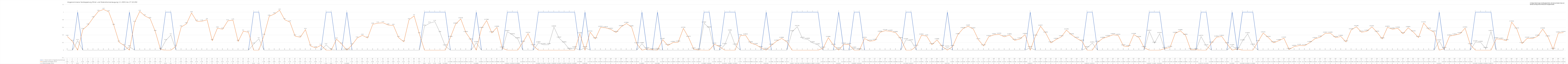
| Category | 1 = Strom reicht im Tagesdurchschnitt aus | Zusätzlich benötigter Strom | Überschüssiger Strom |
|---|---|---|---|
| 0 | 0 | 0.36 | 0 |
| 1 | 0 | 0.23 | 0 |
| 2 | 1 | 0 | 0.25 |
| 3 | 0 | 0.54 | 0 |
| 4 | 0 | 0.66 | 0 |
| 5 | 0 | 0.85 | 0 |
| 6 | 0 | 1.02 | 0 |
| 7 | 0 | 1.07 | 0 |
| 8 | 0 | 1.01 | 0 |
| 9 | 0 | 0.65 | 0 |
| 10 | 0 | 0.21 | 0 |
| 11 | 0 | 0.12 | 0 |
| 12 | 1 | 0 | 0.09 |
| 13 | 0 | 0.73 | 0 |
| 14 | 0 | 1.02 | 0 |
| 15 | 0 | 0.9 | 0 |
| 16 | 0 | 0.83 | 0 |
| 17 | 0 | 0.49 | 0 |
| 18 | 0 | 0.02 | 0 |
| 19 | 1 | 0 | 0.25 |
| 20 | 1 | 0 | 0.4 |
| 21 | 0 | 0.1 | 0 |
| 22 | 0 | 0.61 | 0 |
| 23 | 0 | 0.69 | 0 |
| 24 | 0 | 0.98 | 0 |
| 25 | 0 | 0.76 | 0 |
| 26 | 0 | 0.76 | 0 |
| 27 | 0 | 0.8 | 0 |
| 28 | 0 | 0.25 | 0 |
| 29 | 0 | 0.58 | 0 |
| 30 | 0 | 0.55 | 0 |
| 31 | 0 | 0.77 | 0 |
| 32 | 0 | 0.79 | 0 |
| 33 | 0 | 0.23 | 0 |
| 34 | 0 | 0.5 | 0 |
| 35 | 0 | 0.47 | 0 |
| 36 | 1 | 0 | 0.16 |
| 37 | 1 | 0 | 0.3 |
| 38 | 0 | 0.39 | 0 |
| 39 | 0 | 0.89 | 0 |
| 40 | 0 | 0.95 | 0 |
| 41 | 0 | 1.05 | 0 |
| 42 | 0 | 0.8 | 0 |
| 43 | 0 | 0.74 | 0 |
| 44 | 0 | 0.37 | 0 |
| 45 | 0 | 0.34 | 0 |
| 46 | 0 | 0.54 | 0 |
| 47 | 0 | 0.11 | 0 |
| 48 | 0 | 0.06 | 0 |
| 49 | 0 | 0.13 | 0 |
| 50 | 1 | 0 | 0.14 |
| 51 | 1 | 0 | 0.01 |
| 52 | 0 | 0.29 | 0 |
| 53 | 0 | 0.16 | 0 |
| 54 | 1 | 0 | 0 |
| 55 | 0 | 0.14 | 0 |
| 56 | 0 | 0.32 | 0 |
| 57 | 0 | 0.39 | 0 |
| 58 | 0 | 0.32 | 0 |
| 59 | 0 | 0.68 | 0 |
| 60 | 0 | 0.71 | 0 |
| 61 | 0 | 0.72 | 0 |
| 62 | 0 | 0.66 | 0 |
| 63 | 0 | 0.65 | 0 |
| 64 | 0 | 0.33 | 0 |
| 65 | 0 | 0.22 | 0 |
| 66 | 0 | 0.8 | 0 |
| 67 | 0 | 0.9 | 0 |
| 68 | 0 | 0.43 | 0 |
| 69 | 1 | 0 | 0.63 |
| 70 | 1 | 0 | 0.71 |
| 71 | 1 | 0 | 0.75 |
| 72 | 1 | 0 | 0.46 |
| 73 | 1 | 0 | 0.11 |
| 74 | 0 | 0.335 | 0 |
| 75 | 0 | 0.683 | 0 |
| 76 | 0 | 0.822 | 0 |
| 77 | 0 | 0.459 | 0 |
| 78 | 0 | 0.265 | 0 |
| 79 | 1 | 0 | 0.195 |
| 80 | 0 | 0.568 | 0 |
| 81 | 0 | 0.78 | 0 |
| 82 | 0 | 0.454 | 0 |
| 83 | 0 | 0.6 | 0 |
| 84 | 0 | 0.055 | 0 |
| 85 | 1 | 0 | 0.484 |
| 86 | 1 | 0 | 0.402 |
| 87 | 1 | 0 | 0.297 |
| 88 | 0 | 0.206 | 0 |
| 89 | 0 | 0.437 | 0 |
| 90 | 0 | 0.115 | 0 |
| 91 | 1 | 0 | 0.189 |
| 92 | 1 | 0 | 0.142 |
| 93 | 1 | 0 | 0.144 |
| 94 | 1 | 0 | 0.606 |
| 95 | 1 | 0 | 0.315 |
| 96 | 1 | 0 | 0.189 |
| 97 | 1 | 0 | 0.021 |
| 98 | 1 | 0 | 0.059 |
| 99 | 0 | 0.428 | 0 |
| 100 | 1 | 0 | 0.063 |
| 101 | 0 | 0.473 | 0 |
| 102 | 0 | 0.298 | 0 |
| 103 | 0 | 0.597 | 0 |
| 104 | 0 | 0.587 | 0 |
| 105 | 0 | 0.546 | 0 |
| 106 | 0 | 0.465 | 0 |
| 107 | 0 | 0.616 | 0 |
| 108 | 0 | 0.701 | 0 |
| 109 | 0 | 0.61 | 0 |
| 110 | 0 | 0.166 | 0 |
| 111 | 1 | 0 | 0.17 |
| 112 | 0 | 0.034 | 0 |
| 113 | 0 | 0.014 | 0 |
| 114 | 1 | 0 | 0.016 |
| 115 | 0 | 0.277 | 0 |
| 116 | 0 | 0.123 | 0 |
| 117 | 0 | 0.2 | 0 |
| 118 | 0 | 0.21 | 0 |
| 119 | 0 | 0.573 | 0 |
| 120 | 0 | 0.335 | 0 |
| 121 | 0 | 0.028 | 0 |
| 122 | 0 | 0.003 | 0 |
| 123 | 1 | 0 | 0.71 |
| 124 | 1 | 0 | 0.582 |
| 125 | 0 | 0.155 | 0 |
| 126 | 0 | 0.092 | 0 |
| 127 | 1 | 0 | 0.142 |
| 128 | 1 | 0 | 0.5 |
| 129 | 1 | 0 | 0.131 |
| 130 | 0 | 0.379 | 0 |
| 131 | 0 | 0.395 | 0 |
| 132 | 0 | 0.188 | 0 |
| 133 | 0 | 0.143 | 0 |
| 134 | 0 | 0.064 | 0 |
| 135 | 1 | 0 | 0.021 |
| 136 | 0 | 0.129 | 0 |
| 137 | 0 | 0.236 | 0 |
| 138 | 0 | 0.309 | 0 |
| 139 | 0 | 0.217 | 0 |
| 140 | 1 | 0 | 0.482 |
| 141 | 1 | 0 | 0.617 |
| 142 | 1 | 0 | 0.307 |
| 143 | 1 | 0 | 0.283 |
| 144 | 1 | 0 | 0.189 |
| 145 | 1 | 0 | 0.138 |
| 146 | 0 | 0.052 | 0 |
| 147 | 0 | 0.329 | 0 |
| 148 | 0 | 0.128 | 0 |
| 149 | 1 | 0 | 0.035 |
| 150 | 0 | 0.156 | 0 |
| 151 | 0 | 0.146 | 0 |
| 152 | 1 | 0 | 0.05 |
| 153 | 1 | 0 | 0.014 |
| 154 | 0 | 0.307 | 0 |
| 155 | 0 | 0.234 | 0 |
| 156 | 0 | 0.255 | 0 |
| 157 | 0 | 0.469 | 0 |
| 158 | 0 | 0.512 | 0 |
| 159 | 0 | 0.495 | 0 |
| 160 | 0 | 0.461 | 0 |
| 161 | 0 | 0.3 | 0 |
| 162 | 1 | 0 | 0.274 |
| 163 | 1 | 0 | 0.243 |
| 164 | 0 | 0.101 | 0 |
| 165 | 0 | 0.393 | 0 |
| 166 | 0 | 0.369 | 0 |
| 167 | 0 | 0.144 | 0 |
| 168 | 0 | 0.27 | 0 |
| 169 | 0 | 0.095 | 0 |
| 170 | 1 | 0 | 0.077 |
| 171 | 0 | 0.095 | 0 |
| 172 | 0 | 0.406 | 0 |
| 173 | 0 | 0.563 | 0 |
| 174 | 0 | 0.63 | 0 |
| 175 | 0 | 0.556 | 0 |
| 176 | 0 | 0.273 | 0 |
| 177 | 0 | 0.11 | 0 |
| 178 | 0 | 0.355 | 0 |
| 179 | 0 | 0.403 | 0 |
| 180 | 0 | 0.415 | 0 |
| 181 | 0 | 0.351 | 0 |
| 182 | 0 | 0.399 | 0 |
| 183 | 0 | 0.258 | 0 |
| 184 | 0 | 0.293 | 0 |
| 185 | 0 | 0.408 | 0 |
| 186 | 1 | 0 | 0.065 |
| 187 | 0 | 0.367 | 0 |
| 188 | 0 | 0.629 | 0 |
| 189 | 0 | 0.448 | 0 |
| 190 | 0 | 0.191 | 0 |
| 191 | 0 | 0.281 | 0 |
| 192 | 0 | 0.35 | 0 |
| 193 | 0 | 0.528 | 0 |
| 194 | 0 | 0.402 | 0 |
| 195 | 0 | 0.31 | 0 |
| 196 | 0 | 0.235 | 0 |
| 197 | 1 | 0 | 0.063 |
| 198 | 1 | 0 | 0.187 |
| 199 | 0 | 0.206 | 0 |
| 200 | 0 | 0.309 | 0 |
| 201 | 0 | 0.354 | 0 |
| 202 | 0 | 0.404 | 0 |
| 203 | 0 | 0.388 | 0 |
| 204 | 0 | 0.11 | 0 |
| 205 | 0 | 0.093 | 0 |
| 206 | 0 | 0.41 | 0 |
| 207 | 0 | 0.329 | 0 |
| 208 | 0 | 0.066 | 0 |
| 209 | 1 | 0 | 0.493 |
| 210 | 1 | 0 | 0.182 |
| 211 | 1 | 0 | 0.433 |
| 212 | 0 | 0.042 | 0 |
| 213 | 0 | 0.071 | 0 |
| 214 | 0 | 0.441 | 0 |
| 215 | 0 | 0.51 | 0 |
| 216 | 0 | 0.389 | 0 |
| 217 | 0 | 0.012 | 0 |
| 218 | 0 | 0.011 | 0 |
| 219 | 1 | 0 | 0.358 |
| 220 | 1 | 0 | 0.112 |
| 221 | 0 | 0.184 | 0 |
| 222 | 0 | 0.34 | 0 |
| 223 | 0 | 0.36 | 0 |
| 224 | 0 | 0.168 | 0 |
| 225 | 1 | 0 | 0.116 |
| 226 | 0 | 0.036 | 0 |
| 227 | 1 | 0 | 0.242 |
| 228 | 1 | 0 | 0.43 |
| 229 | 1 | 0 | 0.129 |
| 230 | 0 | 0.223 | 0 |
| 231 | 0 | 0.451 | 0 |
| 232 | 0 | 0.331 | 0 |
| 233 | 0 | 0.194 | 0 |
| 234 | 0 | 0.249 | 0 |
| 235 | 0 | 0.314 | 0 |
| 236 | 0 | 0.019 | 0 |
| 237 | 0 | 0.095 | 0 |
| 238 | 0 | 0.122 | 0 |
| 239 | 0 | 0.118 | 0 |
| 240 | 0 | 0.198 | 0 |
| 241 | 0 | 0.302 | 0 |
| 242 | 0 | 0.341 | 0 |
| 243 | 0 | 0.444 | 0 |
| 244 | 0 | 0.445 | 0 |
| 245 | 0 | 0.329 | 0 |
| 246 | 0 | 0.361 | 0 |
| 247 | 0 | 0.216 | 0 |
| 248 | 0 | 0.534 | 0 |
| 249 | 0 | 0.615 | 0 |
| 250 | 0 | 0.472 | 0 |
| 251 | 0 | 0.495 | 0 |
| 252 | 0 | 0.613 | 0 |
| 253 | 0 | 0.47 | 0 |
| 254 | 0 | 0.296 | 0 |
| 255 | 0 | 0.6 | 0 |
| 256 | 0 | 0.55 | 0 |
| 257 | 0 | 0.576 | 0 |
| 258 | 0 | 0.432 | 0 |
| 259 | 0 | 0.59 | 0 |
| 260 | 0 | 0.477 | 0 |
| 261 | 0 | 0.331 | 0 |
| 262 | 0 | 0.714 | 0 |
| 263 | 0 | 0.548 | 0 |
| 264 | 0 | 0.476 | 0 |
| 265 | 1 | 0 | 0.242 |
| 266 | 0 | 0.041 | 0 |
| 267 | 0 | 0.369 | 0 |
| 268 | 0 | 0.396 | 0 |
| 269 | 0 | 0.43 | 0 |
| 270 | 0 | 0.579 | 0 |
| 271 | 0 | 0.143 | 0 |
| 272 | 1 | 0 | 0.215 |
| 273 | 1 | 0 | 0.205 |
| 274 | 1 | 0 | 0.042 |
| 275 | 1 | 0 | 0.487 |
| 276 | 0 | 0.297 | 0 |
| 277 | 0 | 0.287 | 0 |
| 278 | 0 | 0.249 | 0 |
| 279 | 0 | 0.736 | 0 |
| 280 | 0 | 0.554 | 0 |
| 281 | 0 | 0.174 | 0 |
| 282 | 0 | 0.313 | 0 |
| 283 | 0 | 0.303 | 0 |
| 284 | 0 | 0.365 | 0 |
| 285 | 0 | 0.552 | 0 |
| 286 | 0 | 0.346 | 0 |
| 287 | 0 | 0.022 | 0 |
| 288 | 0 | 0.449 | 0 |
| 289 | 0 | 0.462 | 0 |